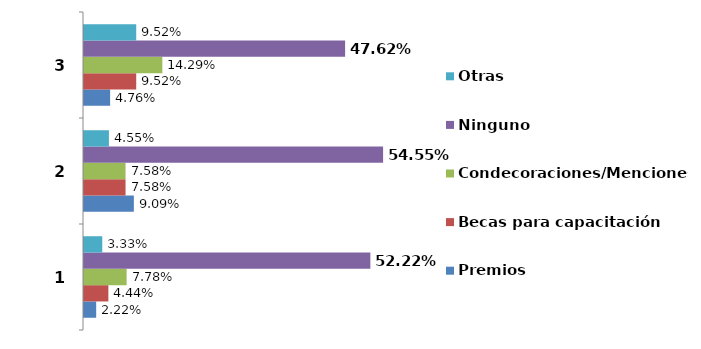
| Category | Premios | Becas para capacitación | Condecoraciones/Menciones | Ninguno | Otras |
|---|---|---|---|---|---|
| 0 | 0.022 | 0.044 | 0.078 | 0.522 | 0.033 |
| 1 | 0.091 | 0.076 | 0.076 | 0.545 | 0.045 |
| 2 | 0.048 | 0.095 | 0.143 | 0.476 | 0.095 |